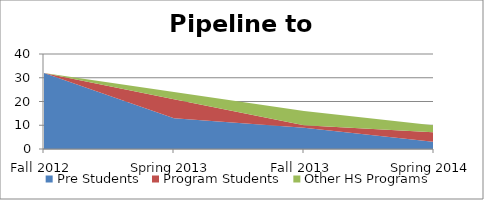
| Category | Pre Students | Program Students | Other HS Programs |
|---|---|---|---|
| Fall 2012 | 32 | 0 | 0 |
| Spring 2013 | 13 | 8 | 3 |
| Fall 2013 | 9 | 1 | 6 |
| Spring 2014 | 3 | 4 | 3 |